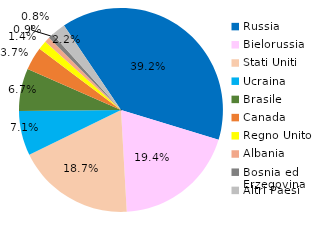
| Category | Series 0 |
|---|---|
| Russia | 1007.451 |
| Bielorussia | 498.358 |
| Stati Uniti | 480.482 |
| Ucraina | 182.09 |
| Brasile | 172.855 |
| Canada | 94.836 |
| Regno Unito | 36.348 |
| Albania | 21.769 |
| Bosnia ed Erzegovina | 20.049 |
| Altri Paesi | 57.748 |